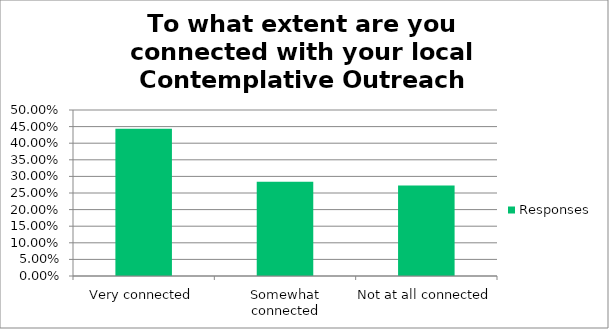
| Category | Responses |
|---|---|
| Very connected | 0.443 |
| Somewhat connected | 0.284 |
| Not at all connected | 0.273 |